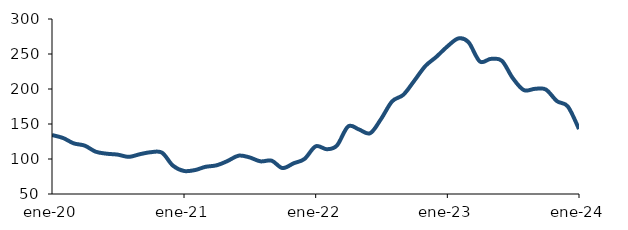
| Category | Series 0 |
|---|---|
| 2020-01-01 | 134.255 |
| 2020-02-01 | 129.901 |
| 2020-03-01 | 122.394 |
| 2020-04-01 | 119.057 |
| 2020-05-01 | 110.456 |
| 2020-06-01 | 107.554 |
| 2020-07-01 | 106.253 |
| 2020-08-01 | 103.049 |
| 2020-09-01 | 106.902 |
| 2020-10-01 | 109.711 |
| 2020-11-01 | 109.011 |
| 2020-12-01 | 90.634 |
| 2021-01-01 | 82.908 |
| 2021-02-01 | 84.275 |
| 2021-03-01 | 88.757 |
| 2021-04-01 | 90.964 |
| 2021-05-01 | 96.958 |
| 2021-06-01 | 104.739 |
| 2021-07-01 | 102.396 |
| 2021-08-01 | 96.652 |
| 2021-09-01 | 97.59 |
| 2021-10-01 | 87.03 |
| 2021-11-01 | 93.888 |
| 2021-12-01 | 100.079 |
| 2022-01-01 | 118.131 |
| 2022-02-01 | 113.977 |
| 2022-03-01 | 119.323 |
| 2022-04-01 | 146.553 |
| 2022-05-01 | 142.197 |
| 2022-06-01 | 136.794 |
| 2022-07-01 | 156.982 |
| 2022-08-01 | 182.397 |
| 2022-09-01 | 191.729 |
| 2022-10-01 | 211.533 |
| 2022-11-01 | 232.804 |
| 2022-12-01 | 245.717 |
| 2023-01-01 | 260.755 |
| 2023-02-01 | 272.318 |
| 2023-03-01 | 266.675 |
| 2023-04-01 | 239.339 |
| 2023-05-01 | 242.987 |
| 2023-06-01 | 240.419 |
| 2023-07-01 | 215.813 |
| 2023-08-01 | 198.437 |
| 2023-09-01 | 200.263 |
| 2023-10-01 | 199.285 |
| 2023-11-01 | 182.66 |
| 2023-12-01 | 175.051 |
| 2024-01-01 | 142.806 |